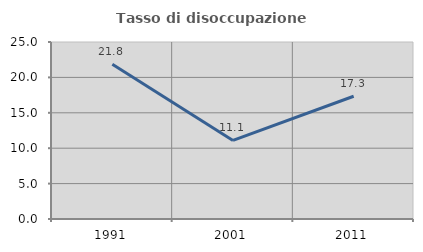
| Category | Tasso di disoccupazione giovanile  |
|---|---|
| 1991.0 | 21.846 |
| 2001.0 | 11.094 |
| 2011.0 | 17.336 |